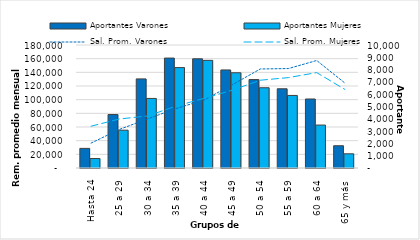
| Category | Aportantes Varones | Aportantes Mujeres |
|---|---|---|
| Hasta 24 | 1595 | 771 |
| 25 a 29 | 4348 | 3075 |
| 30 a 34 | 7245 | 5655 |
| 35 a 39 | 8938 | 8165 |
| 40 a 44 | 8878 | 8751 |
| 45 a 49 | 7972 | 7743 |
| 50 a 54 | 7191 | 6525 |
| 55 a 59 | 6441 | 5899 |
| 60 a 64 | 5610 | 3491 |
| 65 y más | 1810 | 1154 |